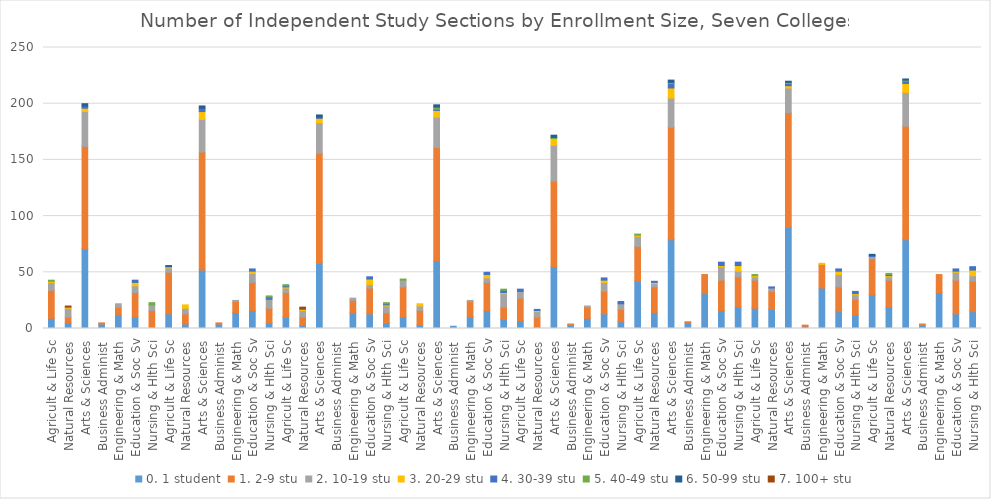
| Category | 0. 1 student | 1. 2-9 stu | 2. 10-19 stu | 3. 20-29 stu | 4. 30-39 stu | 5. 40-49 stu | 6. 50-99 stu | 7. 100+ stu |
|---|---|---|---|---|---|---|---|---|
| 0 | 9 | 25 | 7 | 1 | 0 | 1 | 0 | 0 |
| 1 | 5 | 5 | 8 | 1 | 0 | 0 | 0 | 1 |
| 2 | 71 | 91 | 31 | 3 | 2 | 0 | 2 | 0 |
| 3 | 4 | 1 | 0 | 0 | 0 | 0 | 0 | 0 |
| 4 | 12 | 7 | 3 | 0 | 0 | 0 | 0 | 0 |
| 5 | 10 | 22 | 6 | 3 | 2 | 0 | 0 | 0 |
| 6 | 0 | 16 | 5 | 0 | 0 | 2 | 0 | 0 |
| 7 | 13 | 37 | 4 | 1 | 0 | 0 | 1 | 0 |
| 8 | 4 | 9 | 5 | 3 | 0 | 0 | 0 | 0 |
| 9 | 52 | 105 | 29 | 7 | 3 | 0 | 2 | 0 |
| 10 | 4 | 1 | 0 | 0 | 0 | 0 | 0 | 0 |
| 11 | 14 | 10 | 1 | 0 | 0 | 0 | 0 | 0 |
| 12 | 16 | 25 | 8 | 2 | 2 | 0 | 0 | 0 |
| 13 | 5 | 13 | 8 | 0 | 2 | 1 | 0 | 0 |
| 14 | 10 | 22 | 4 | 1 | 1 | 1 | 0 | 0 |
| 15 | 3 | 7 | 6 | 1 | 1 | 0 | 0 | 1 |
| 16 | 58 | 98 | 27 | 4 | 1 | 0 | 2 | 0 |
| 17 | 0 | 0 | 0 | 0 | 0 | 0 | 0 | 0 |
| 18 | 14 | 11 | 2 | 0 | 0 | 0 | 0 | 0 |
| 19 | 13 | 23 | 3 | 5 | 2 | 0 | 0 | 0 |
| 20 | 5 | 9 | 6 | 1 | 1 | 1 | 0 | 0 |
| 21 | 10 | 27 | 6 | 0 | 0 | 1 | 0 | 0 |
| 22 | 3 | 13 | 4 | 2 | 0 | 0 | 0 | 0 |
| 23 | 60 | 101 | 27 | 6 | 1 | 2 | 2 | 0 |
| 24 | 2 | 0 | 0 | 0 | 0 | 0 | 0 | 0 |
| 25 | 10 | 14 | 1 | 0 | 0 | 0 | 0 | 0 |
| 26 | 16 | 25 | 4 | 3 | 2 | 0 | 0 | 0 |
| 27 | 8 | 11 | 12 | 1 | 2 | 1 | 0 | 0 |
| 28 | 7 | 20 | 6 | 0 | 2 | 0 | 0 | 0 |
| 29 | 1 | 9 | 5 | 1 | 1 | 0 | 0 | 0 |
| 30 | 55 | 76 | 32 | 6 | 0 | 1 | 2 | 0 |
| 31 | 3 | 1 | 0 | 0 | 0 | 0 | 0 | 0 |
| 32 | 9 | 10 | 1 | 0 | 0 | 0 | 0 | 0 |
| 33 | 13 | 20 | 8 | 2 | 2 | 0 | 0 | 0 |
| 34 | 6 | 11 | 5 | 0 | 2 | 0 | 0 | 0 |
| 35 | 42 | 31 | 9 | 1 | 0 | 1 | 0 | 0 |
| 36 | 14 | 23 | 3 | 1 | 1 | 0 | 0 | 0 |
| 37 | 79 | 100 | 26 | 9 | 4 | 1 | 2 | 0 |
| 38 | 5 | 1 | 0 | 0 | 0 | 0 | 0 | 0 |
| 39 | 31 | 17 | 0 | 0 | 0 | 0 | 0 | 0 |
| 40 | 16 | 27 | 12 | 1 | 3 | 0 | 0 | 0 |
| 41 | 19 | 27 | 5 | 5 | 3 | 0 | 0 | 0 |
| 42 | 18 | 25 | 3 | 1 | 0 | 1 | 0 | 0 |
| 43 | 17 | 16 | 3 | 0 | 1 | 0 | 0 | 0 |
| 44 | 90 | 102 | 22 | 2 | 2 | 1 | 1 | 0 |
| 45 | 2 | 1 | 0 | 0 | 0 | 0 | 0 | 0 |
| 46 | 36 | 21 | 0 | 1 | 0 | 0 | 0 | 0 |
| 47 | 15 | 22 | 11 | 3 | 2 | 0 | 0 | 0 |
| 48 | 12 | 14 | 4 | 1 | 2 | 0 | 0 | 0 |
| 49 | 30 | 32 | 2 | 0 | 1 | 0 | 1 | 0 |
| 50 | 19 | 24 | 3 | 1 | 1 | 1 | 0 | 0 |
| 51 | 79 | 101 | 30 | 8 | 2 | 1 | 1 | 0 |
| 52 | 3 | 1 | 0 | 0 | 0 | 0 | 0 | 0 |
| 53 | 32 | 16 | 0 | 0 | 0 | 0 | 0 | 0 |
| 54 | 13 | 30 | 7 | 1 | 2 | 0 | 0 | 0 |
| 55 | 15 | 27 | 5 | 5 | 3 | 0 | 0 | 0 |